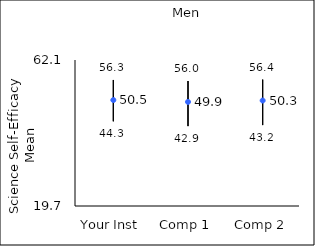
| Category | 25th percentile | 75th percentile | Mean |
|---|---|---|---|
| Your Inst | 44.3 | 56.3 | 50.47 |
| Comp 1 | 42.9 | 56 | 49.93 |
| Comp 2 | 43.2 | 56.4 | 50.33 |